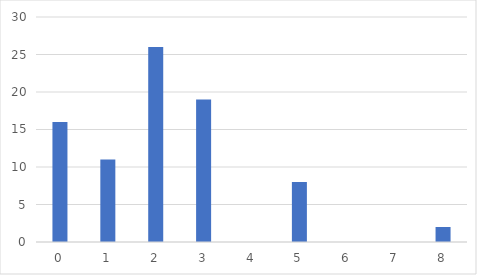
| Category | Series 0 |
|---|---|
| 0.0 | 16 |
| 1.0 | 11 |
| 2.0 | 26 |
| 3.0 | 19 |
| 4.0 | 0 |
| 5.0 | 8 |
| 6.0 | 0 |
| 7.0 | 0 |
| 8.0 | 2 |